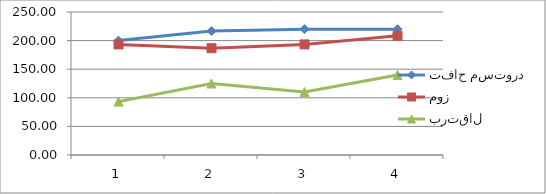
| Category | تفاح مستورد | موز | برتقال |
|---|---|---|---|
| 0 | 200 | 193.33 | 93.33 |
| 1 | 216.67 | 186.67 | 125 |
| 2 | 220 | 193.33 | 110 |
| 3 | 220 | 208.57 | 140 |